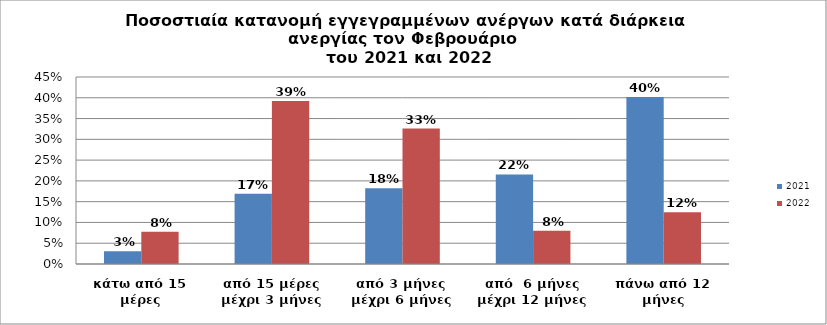
| Category | 2021 | 2022 |
|---|---|---|
| κάτω από 15 μέρες | 0.031 | 0.078 |
| από 15 μέρες μέχρι 3 μήνες | 0.169 | 0.392 |
| από 3 μήνες μέχρι 6 μήνες | 0.183 | 0.326 |
| από  6 μήνες μέχρι 12 μήνες | 0.215 | 0.08 |
| πάνω από 12 μήνες | 0.402 | 0.124 |